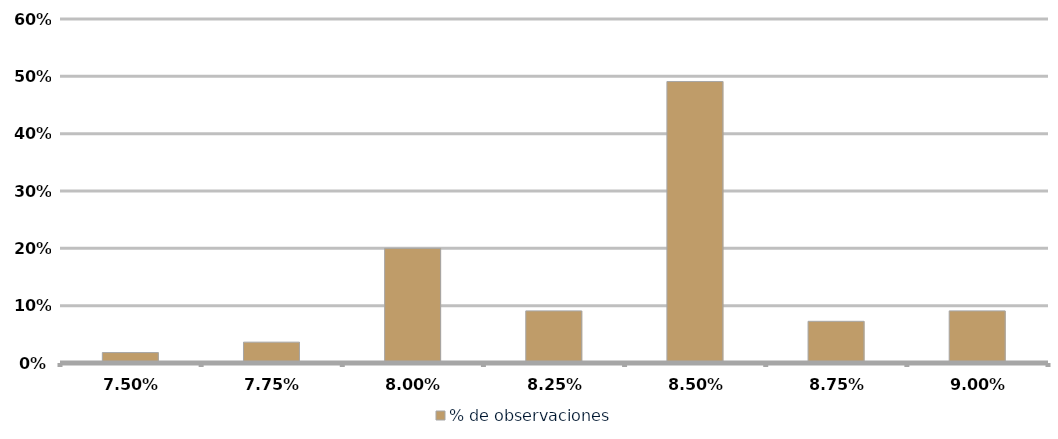
| Category | % de observaciones  |
|---|---|
| 0.075 | 0.018 |
| 0.0775 | 0.036 |
| 0.08 | 0.2 |
| 0.0825 | 0.091 |
| 0.085 | 0.491 |
| 0.08750000000000001 | 0.073 |
| 0.09000000000000001 | 0.091 |